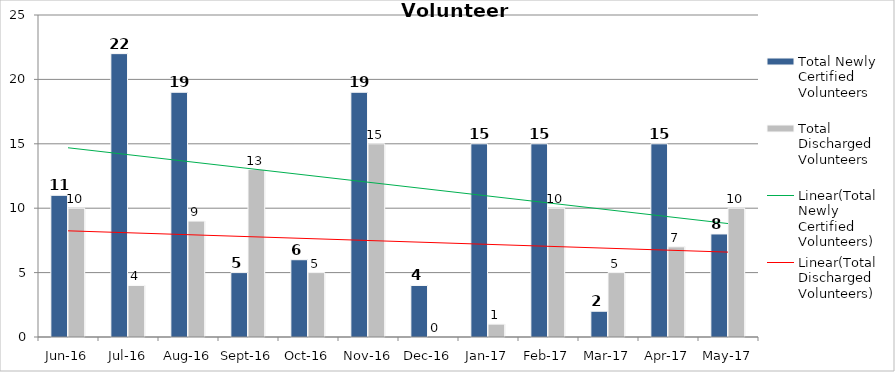
| Category | Total Newly Certified Volunteers | Total Discharged Volunteers |
|---|---|---|
| Jun-16 | 11 | 10 |
| Jul-16 | 22 | 4 |
| Aug-16 | 19 | 9 |
| Sep-16 | 5 | 13 |
| Oct-16 | 6 | 5 |
| Nov-16 | 19 | 15 |
| Dec-16 | 4 | 0 |
| Jan-17 | 15 | 1 |
| Feb-17 | 15 | 10 |
| Mar-17 | 2 | 5 |
| Apr-17 | 15 | 7 |
| May-17 | 8 | 10 |